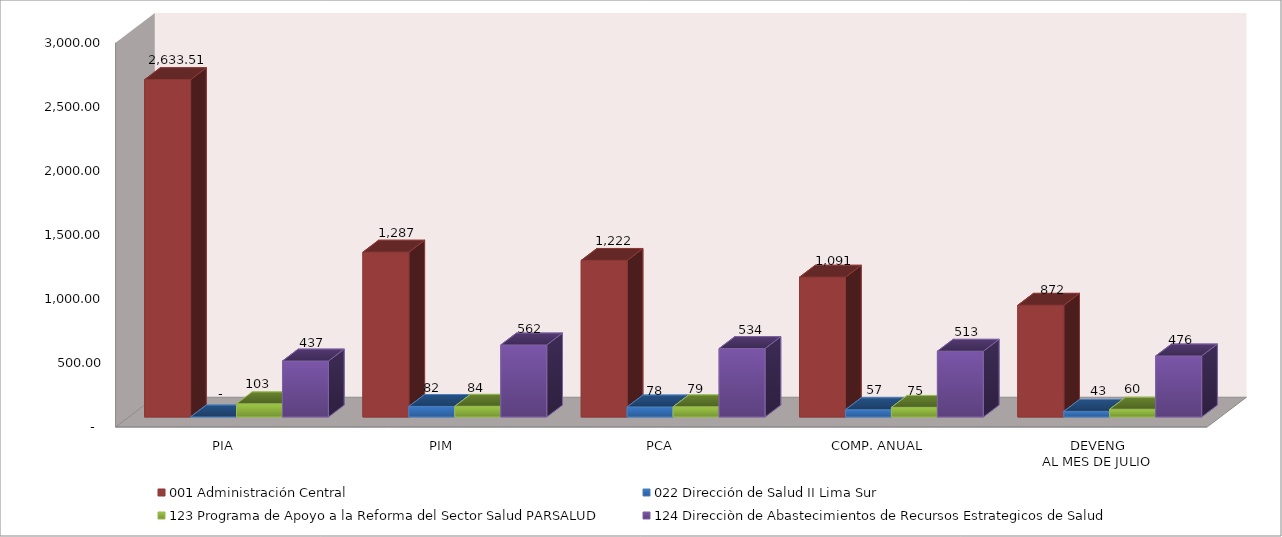
| Category | 001 Administración Central | 022 Dirección de Salud II Lima Sur | 123 Programa de Apoyo a la Reforma del Sector Salud PARSALUD | 124 Direcciòn de Abastecimientos de Recursos Estrategicos de Salud |
|---|---|---|---|---|
| PIA | 2633.509 | 0 | 102.766 | 436.8 |
| PIM | 1286.717 | 82.274 | 83.587 | 562.298 |
| PCA | 1222.381 | 78.16 | 79.407 | 534.183 |
| COMP. ANUAL | 1091.35 | 56.639 | 74.859 | 513.324 |
| DEVENG
AL MES DE JULIO | 872.023 | 43.365 | 60.326 | 476.393 |